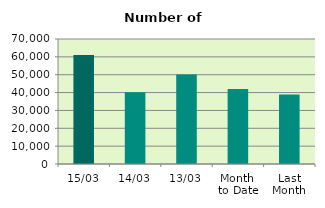
| Category | Series 0 |
|---|---|
| 15/03 | 61020 |
| 14/03 | 40128 |
| 13/03 | 50110 |
| Month 
to Date | 41954.545 |
| Last
Month | 38877.2 |